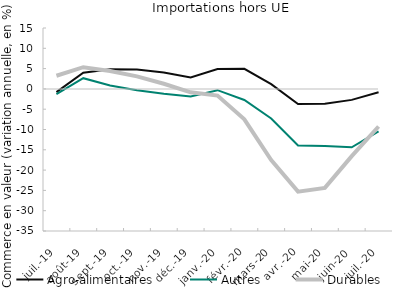
| Category | Agro-alimentaires | Autres | Durables |
|---|---|---|---|
| 2019-07-01 | -0.788 | -1.304 | 3.239 |
| 2019-08-01 | 3.985 | 2.636 | 5.35 |
| 2019-09-01 | 4.811 | 0.846 | 4.41 |
| 2019-10-01 | 4.748 | -0.318 | 3.085 |
| 2019-11-01 | 4.045 | -1.193 | 1.275 |
| 2019-12-01 | 2.837 | -1.84 | -0.836 |
| 2020-01-01 | 4.876 | -0.316 | -1.638 |
| 2020-02-01 | 4.941 | -2.729 | -7.502 |
| 2020-03-01 | 1.17 | -7.29 | -17.529 |
| 2020-04-01 | -3.708 | -13.921 | -25.311 |
| 2020-05-01 | -3.65 | -14.04 | -24.38 |
| 2020-06-01 | -2.703 | -14.371 | -16.568 |
| 2020-07-01 | -0.84 | -10.466 | -9.268 |